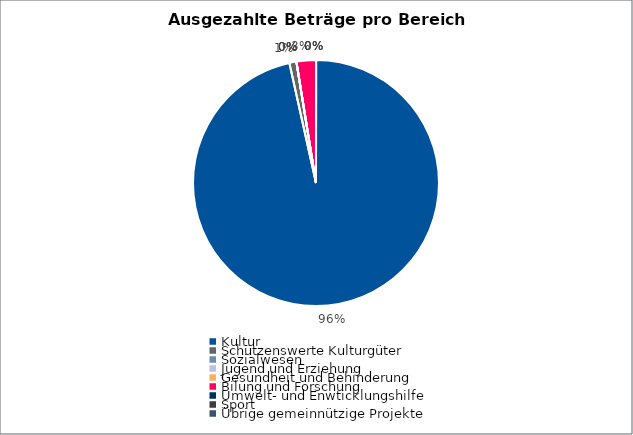
| Category | Series 0 |
|---|---|
| Kultur | 10476721.71 |
| Schützenswerte Kulturgüter | 100000 |
| Sozialwesen | 0 |
| Jugend und Erziehung | 0 |
| Gesundheit und Behinderung | 0 |
| Bilung und Forschung | 277226 |
| Umwelt- und Enwticklungshilfe | 0 |
| Sport | 0 |
| Übrige gemeinnützige Projekte | 0 |